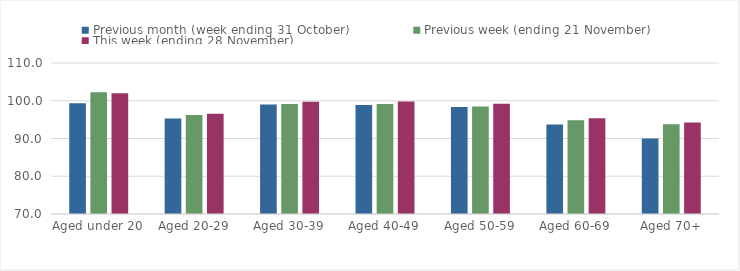
| Category | Previous month (week ending 31 October) | Previous week (ending 21 November) | This week (ending 28 November) |
|---|---|---|---|
| Aged under 20 | 99.31 | 102.28 | 102 |
| Aged 20-29 | 95.3 | 96.21 | 96.57 |
| Aged 30-39 | 98.98 | 99.13 | 99.72 |
| Aged 40-49 | 98.88 | 99.16 | 99.81 |
| Aged 50-59 | 98.32 | 98.48 | 99.23 |
| Aged 60-69 | 93.7 | 94.86 | 95.37 |
| Aged 70+ | 90.03 | 93.79 | 94.21 |